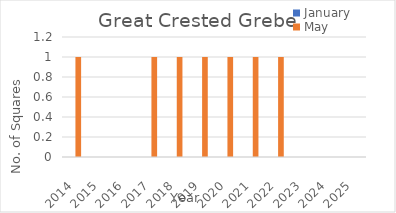
| Category | January | May |
|---|---|---|
| 2014.0 | 0 | 1 |
| 2015.0 | 0 | 0 |
| 2016.0 | 0 | 0 |
| 2017.0 | 0 | 1 |
| 2018.0 | 0 | 1 |
| 2019.0 | 0 | 1 |
| 2020.0 | 0 | 1 |
| 2021.0 | 0 | 1 |
| 2022.0 | 0 | 1 |
| 2023.0 | 0 | 0 |
| 2024.0 | 0 | 0 |
| 2025.0 | 0 | 0 |